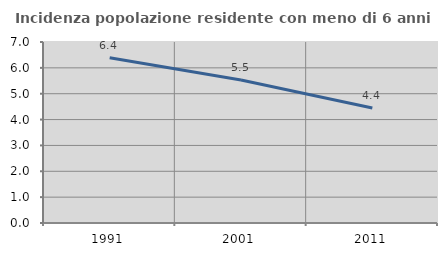
| Category | Incidenza popolazione residente con meno di 6 anni |
|---|---|
| 1991.0 | 6.391 |
| 2001.0 | 5.531 |
| 2011.0 | 4.444 |